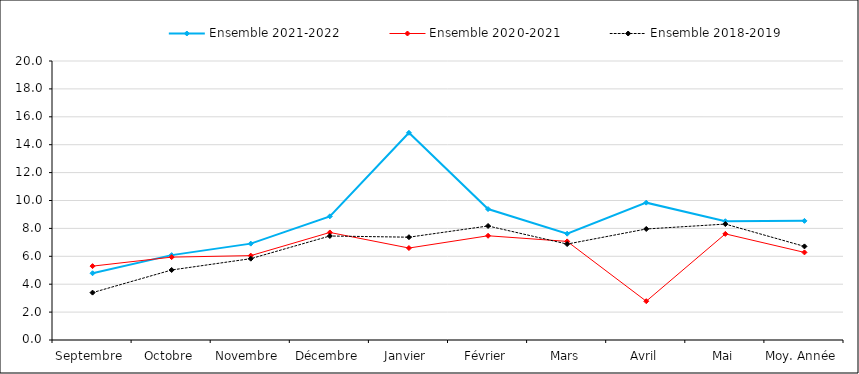
| Category | Ensemble |
|---|---|
| Septembre | 3.397 |
| Octobre | 5.019 |
| Novembre | 5.83 |
| Décembre | 7.456 |
| Janvier | 7.37 |
| Février | 8.174 |
| Mars | 6.877 |
| Avril | 7.957 |
| Mai | 8.31 |
| Moy. Année | 6.71 |